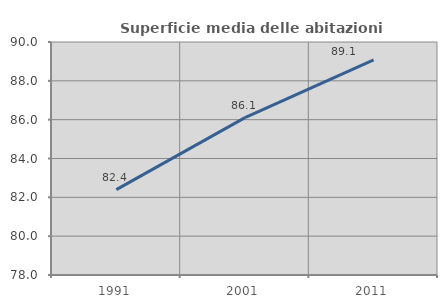
| Category | Superficie media delle abitazioni occupate |
|---|---|
| 1991.0 | 82.396 |
| 2001.0 | 86.103 |
| 2011.0 | 89.077 |